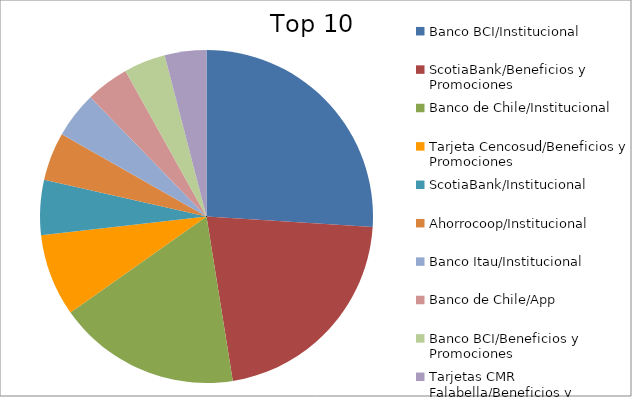
| Category | Series 0 |
|---|---|
| Banco BCI/Institucional | 19.94 |
| ScotiaBank/Beneficios y Promociones | 16.45 |
| Banco de Chile/Institucional | 13.6 |
| Tarjeta Cencosud/Beneficios y Promociones | 6.13 |
| ScotiaBank/Institucional | 4.09 |
| Ahorrocoop/Institucional | 3.59 |
| Banco Itau/Institucional | 3.44 |
| Banco de Chile/App | 3.21 |
| Banco BCI/Beneficios y Promociones | 3.1 |
| Tarjetas CMR Falabella/Beneficios y Promociones | 3.1 |